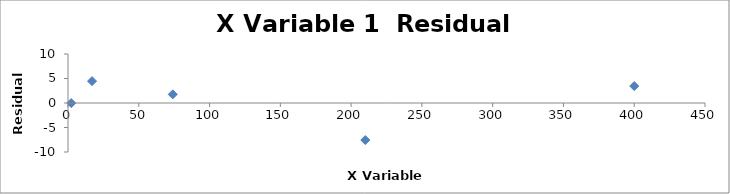
| Category | Series 0 |
|---|---|
| 2.3 | -0.011 |
| 17.0 | 4.459 |
| 74.0 | 1.764 |
| 210.0 | -7.562 |
| 400.0 | 3.454 |